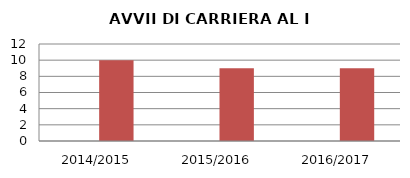
| Category | ANNO | NUMERO |
|---|---|---|
| 2014/2015 | 0 | 10 |
| 2015/2016 | 0 | 9 |
| 2016/2017 | 0 | 9 |